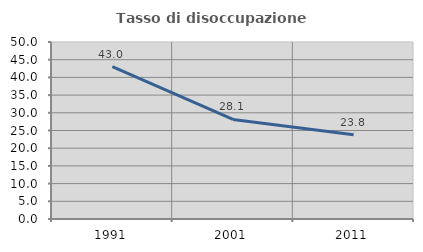
| Category | Tasso di disoccupazione giovanile  |
|---|---|
| 1991.0 | 43.019 |
| 2001.0 | 28.137 |
| 2011.0 | 23.827 |